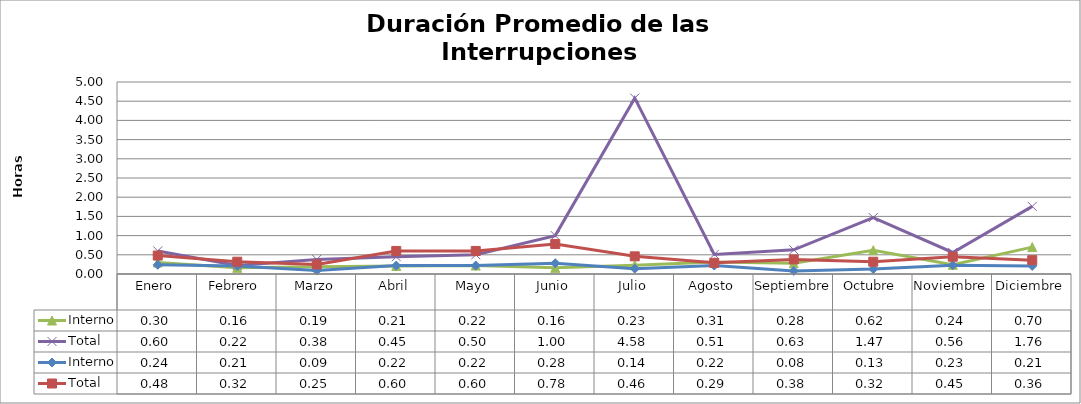
| Category | Interno | Total |
|---|---|---|
| Enero | 0.24 | 0.48 |
| Febrero | 0.21 | 0.32 |
| Marzo | 0.09 | 0.25 |
| Abril | 0.22 | 0.6 |
| Mayo | 0.22 | 0.6 |
| Junio | 0.28 | 0.78 |
| Julio | 0.14 | 0.46 |
| Agosto | 0.22 | 0.29 |
| Septiembre | 0.08 | 0.38 |
| Octubre | 0.13 | 0.32 |
| Noviembre | 0.23 | 0.45 |
| Diciembre | 0.21 | 0.36 |